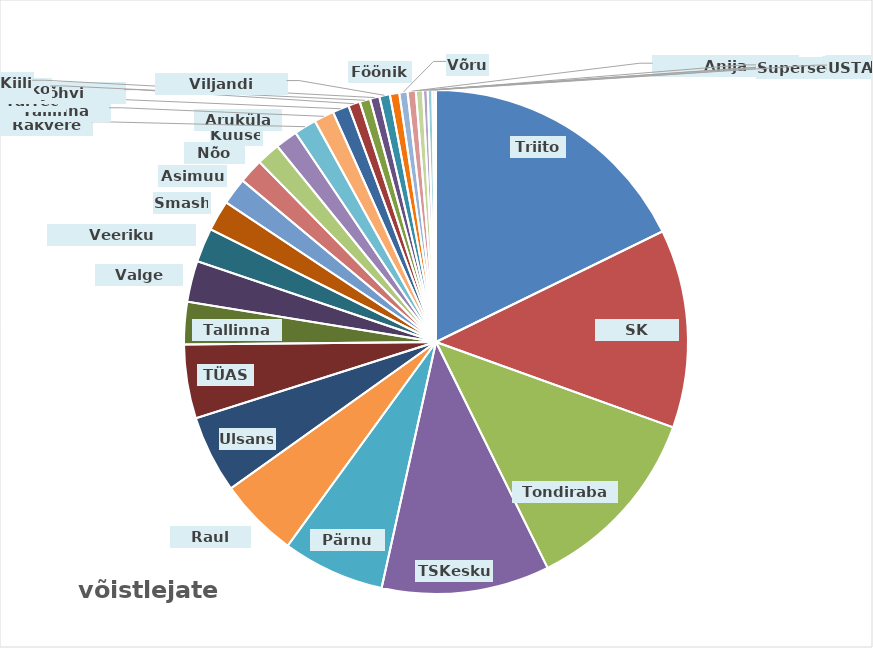
| Category | kokku |
|---|---|
| Triiton | 236 |
| SK Fookus | 169 |
| Tondiraba SK | 162 |
| TSKeskus | 143 |
| Pärnu SK | 87 |
| Raul Must | 68 |
| Ulsans | 66 |
| TÜASK | 63 |
| Tallinna SK | 36 |
| Valge Hani | 35 |
| Veeriku Badminton | 29 |
| Smash | 26 |
| Asimuut | 23 |
| Nõo SK | 21 |
| Kuuse | 20 |
| Aruküla SK | 19 |
| Rakvere SK | 19 |
| Tallinna Kalev | 17 |
| TalTech | 14 |
| Jõhvi Spordikool | 10 |
| Harko | 9 |
| Kiili | 8 |
| Viljandi Sulelised | 9 |
| Fööniks | 8 |
| Võru | 7 |
| Anija Sulgpalliklubi | 7 |
| Puhja | 6 |
| Viimsi | 4 |
| Sarv | 4 |
| Superseeniorid | 2 |
| USTA | 1 |